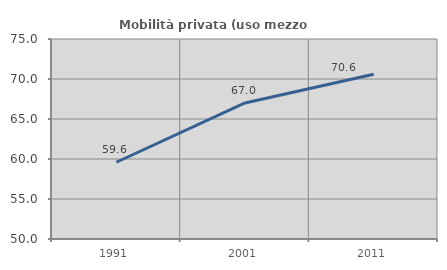
| Category | Mobilità privata (uso mezzo privato) |
|---|---|
| 1991.0 | 59.594 |
| 2001.0 | 67.008 |
| 2011.0 | 70.588 |